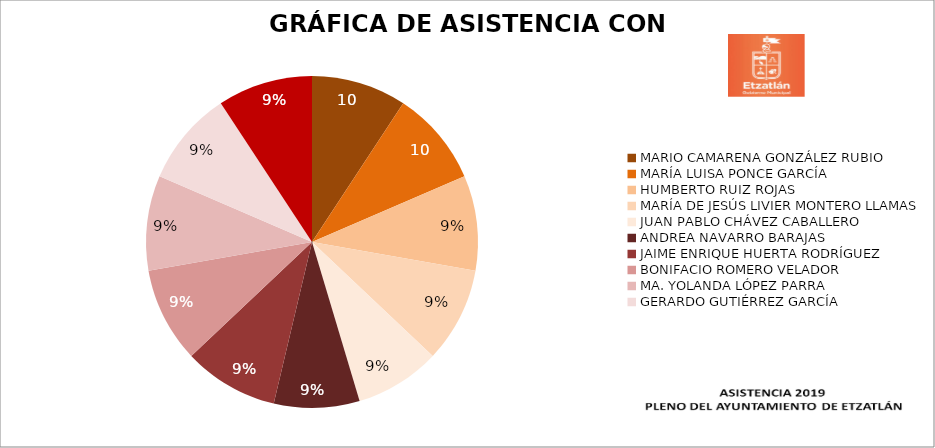
| Category | Series 0 |
|---|---|
| MARIO CAMARENA GONZÁLEZ RUBIO | 100 |
| MARÍA LUISA PONCE GARCÍA | 100 |
| HUMBERTO RUIZ ROJAS | 100 |
| MARÍA DE JESÚS LIVIER MONTERO LLAMAS | 100 |
| JUAN PABLO CHÁVEZ CABALLERO | 90 |
| ANDREA NAVARRO BARAJAS | 90 |
| JAIME ENRIQUE HUERTA RODRÍGUEZ | 100 |
| BONIFACIO ROMERO VELADOR | 100 |
| MA. YOLANDA LÓPEZ PARRA | 100 |
| GERARDO GUTIÉRREZ GARCÍA | 100 |
| ALEJANDRA JIMÉNEZ ZEPEDA | 100 |